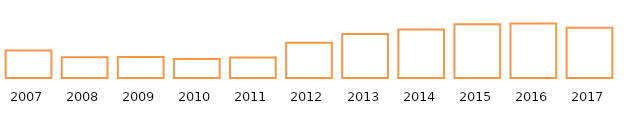
| Category | Overheads |
|---|---|
| 2007.0 | 2656 |
| 2008.0 | 2015 |
| 2009.0 | 2031.5 |
| 2010.0 | 1835 |
| 2011.0 | 1976 |
| 2012.0 | 3410 |
| 2013.0 | 4254 |
| 2014.0 | 4690 |
| 2015.0 | 5193 |
| 2016.0 | 5286 |
| 2017.0 | 4868 |